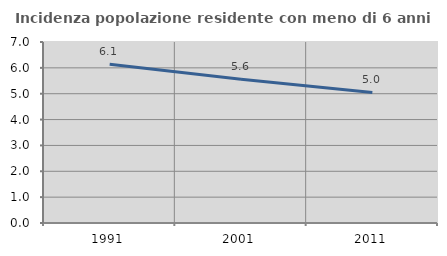
| Category | Incidenza popolazione residente con meno di 6 anni |
|---|---|
| 1991.0 | 6.141 |
| 2001.0 | 5.556 |
| 2011.0 | 5.047 |